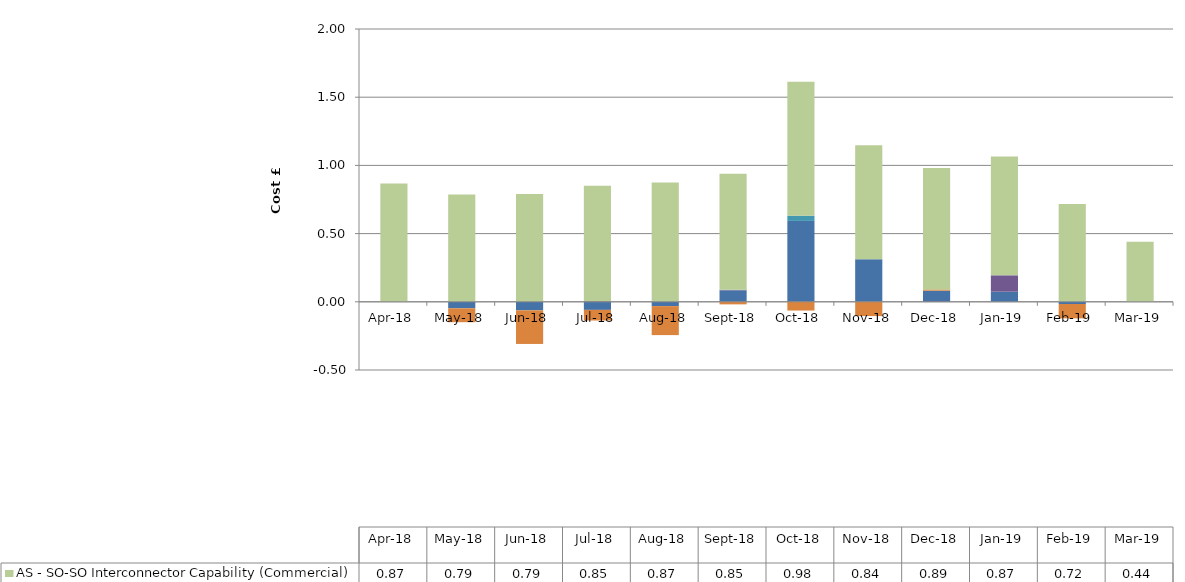
| Category | SO-SO Energy Trades | SO-SO Margin | SO-SO Constrained Margin | SO-SO Footroom | SO-SO Ramping | SO-SO Invoked by External Parties | SO-SO Constraints | AS - SO-SO Interconnector Capability (Commercial) |
|---|---|---|---|---|---|---|---|---|
| 2018-04-30 | 0 | 0 | 0 | 0 | 0 | 0 | 0 | 0.867 |
| 2018-05-31 | -0.048 | 0 | 0 | 0 | 0 | -0.102 | 0 | 0.786 |
| 2018-06-30 | -0.062 | 0 | 0 | 0.001 | 0 | -0.247 | 0 | 0.789 |
| 2018-07-31 | -0.059 | 0 | 0 | 0.004 | 0 | -0.078 | 0 | 0.846 |
| 2018-08-31 | -0.032 | 0 | 0 | 0 | 0 | -0.212 | 0 | 0.875 |
| 2018-09-30 | 0.084 | 0 | 0 | 0.003 | 0.002 | -0.019 | 0 | 0.851 |
| 2018-10-31 | 0.593 | 0 | 0 | 0 | 0.038 | -0.064 | 0 | 0.983 |
| 2018-11-30 | 0.311 | 0 | 0 | 0 | 0 | -0.105 | 0 | 0.836 |
| 2018-12-31 | 0.08 | -0.001 | 0 | 0.001 | 0.001 | 0.009 | 0 | 0.891 |
| 2019-01-31 | 0.074 | 0 | 0 | 0.12 | 0 | 0 | 0 | 0.87 |
| 2019-02-28 | -0.016 | 0 | 0 | 0 | 0 | -0.105 | 0 | 0.716 |
| 2019-03-31 | 0 | 0 | 0 | 0 | 0 | 0 | 0 | 0.441 |